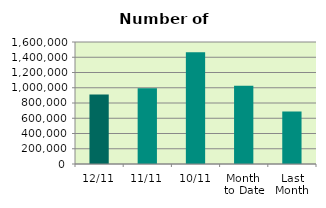
| Category | Series 0 |
|---|---|
| 12/11 | 910884 |
| 11/11 | 992808 |
| 10/11 | 1466854 |
| Month 
to Date | 1025120.222 |
| Last
Month | 689792.182 |